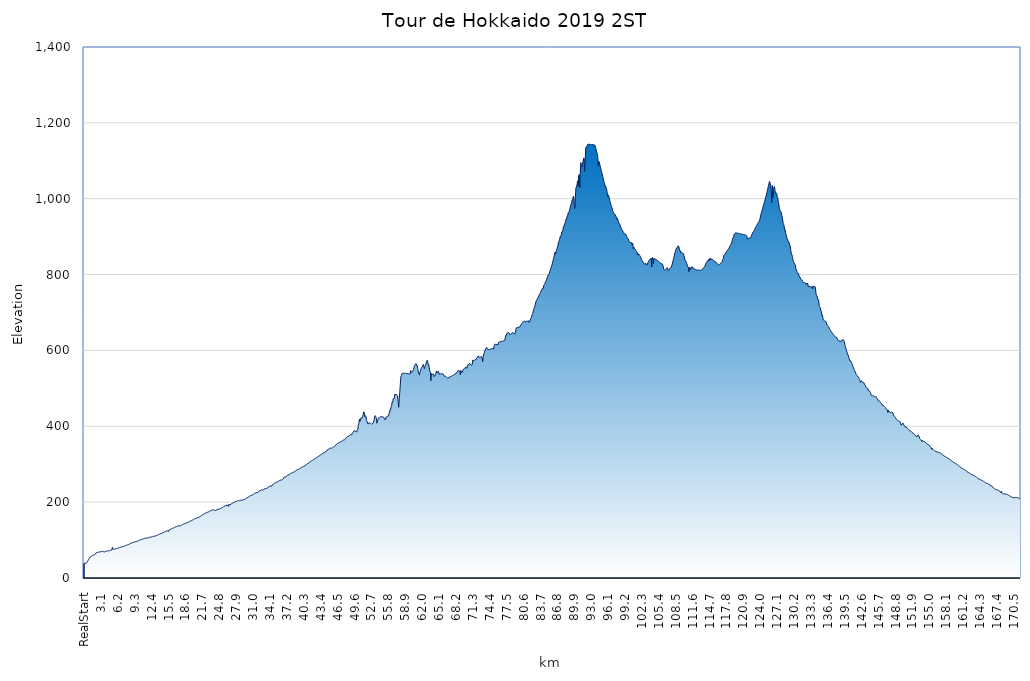
| Category | Ekevation |
|---|---|
| RealStart | 38.4 |
| 0.1  | 39 |
| 0.2  | 38.5 |
| 0.3  | 38.8 |
| 0.4  | 38.6 |
| 0.5  | 40.8 |
| 0.6  | 43 |
| 0.7  | 45.2 |
| 0.8  | 47.4 |
| 0.9  | 49.6 |
| 1.0  | 51.8 |
| 1.1  | 54 |
| 1.2  | 56.2 |
| 1.3  | 57.8 |
| 1.4  | 58 |
| 1.5  | 58.3 |
| 1.6  | 59.6 |
| 1.7  | 60.6 |
| 1.8  | 61 |
| 1.9  | 61.3 |
| 2.0  | 61.7 |
| 2.1  | 62.9 |
| 2.2  | 65.5 |
| 2.3  | 66.8 |
| 2.4  | 67.3 |
| 2.5  | 67.5 |
| 2.6  | 67.9 |
| 2.7  | 68.3 |
| 2.8  | 68.6 |
| 2.9  | 68.9 |
| 3.0  | 69.2 |
| 3.1  | 69.4 |
| 3.2  | 69.5 |
| 3.3  | 70.1 |
| 3.4  | 70.4 |
| 3.5  | 70 |
| 3.6  | 69.1 |
| 3.7  | 69 |
| 3.8  | 68.6 |
| 3.9  | 69.6 |
| 4.0  | 70.1 |
| 4.1  | 70.5 |
| 4.2  | 70.9 |
| 4.3  | 71.6 |
| 4.4  | 71.6 |
| 4.5  | 71.5 |
| 4.6  | 71.9 |
| 4.7  | 72.4 |
| 4.8  | 73 |
| 4.9  | 73.1 |
| 5.0  | 73.5 |
| 5.1  | 73.9 |
| 5.2  | 80.9 |
| 5.3  | 75.3 |
| 5.4  | 75.6 |
| 5.5  | 75.9 |
| 5.6  | 76.2 |
| 5.7  | 76.6 |
| 5.8  | 77.2 |
| 5.9  | 77.5 |
| 6.0  | 77.7 |
| 6.1  | 78 |
| 6.2  | 78.4 |
| 6.3  | 78.9 |
| 6.4  | 79.5 |
| 6.5  | 80 |
| 6.6  | 80.6 |
| 6.7  | 81.2 |
| 6.8  | 81.7 |
| 6.9  | 82.2 |
| 7.0  | 82.5 |
| 7.1  | 82.7 |
| 7.2  | 83 |
| 7.3  | 83.5 |
| 7.4  | 84 |
| 7.5  | 85 |
| 7.6  | 85.2 |
| 7.7  | 85.7 |
| 7.8  | 86.6 |
| 7.9  | 86.6 |
| 8.0  | 87.3 |
| 8.1  | 87.9 |
| 8.2  | 88.4 |
| 8.3  | 89.2 |
| 8.4  | 90.1 |
| 8.5  | 91.1 |
| 8.6  | 91.5 |
| 8.7  | 92 |
| 8.8  | 92.5 |
| 8.9  | 93.1 |
| 9.0  | 93.6 |
| 9.1  | 93.9 |
| 9.2  | 94.5 |
| 9.3  | 95.2 |
| 9.4  | 95.5 |
| 9.5  | 96 |
| 9.6  | 96.2 |
| 9.7  | 97 |
| 9.8  | 97.3 |
| 9.9  | 97.9 |
| 10.0  | 98.6 |
| 10.1  | 99.2 |
| 10.2  | 99.8 |
| 10.3  | 100.6 |
| 10.4  | 101 |
| 10.5  | 101.4 |
| 10.6  | 101.8 |
| 10.7  | 102.1 |
| 10.8  | 102.6 |
| 10.9  | 103.3 |
| 11.0  | 104.1 |
| 11.1  | 104.4 |
| 11.2  | 104.7 |
| 11.3  | 105.3 |
| 11.4  | 105.2 |
| 11.5  | 105.3 |
| 11.6  | 105.3 |
| 11.7  | 105.6 |
| 11.8  | 105.9 |
| 11.9  | 106.4 |
| 12.0  | 107.3 |
| 12.1  | 107 |
| 12.2  | 108 |
| 12.3  | 108 |
| 12.4  | 108 |
| 12.5  | 109 |
| 12.6  | 109 |
| 12.7  | 110 |
| 12.8  | 110 |
| 12.9  | 110 |
| 13.0  | 110 |
| 13.1  | 111 |
| 13.2  | 112 |
| 13.3  | 112 |
| 13.4  | 113 |
| 13.5  | 113 |
| 13.6  | 114 |
| 13.7  | 115 |
| 13.8  | 115 |
| 13.9  | 116 |
| 14.0  | 117 |
| 14.1  | 117 |
| 14.2  | 117 |
| 14.3  | 118 |
| 14.4  | 119 |
| 14.5  | 120 |
| 14.6  | 120 |
| 14.7  | 121 |
| 14.8  | 122 |
| 14.9  | 123 |
| 15.0  | 123 |
| 15.1  | 124 |
| 15.2  | 124 |
| 15.3  | 124 |
| 15.4  | 123 |
| 15.5  | 123 |
| 15.6  | 127 |
| 15.7  | 127.7 |
| 15.8  | 128.2 |
| 15.9  | 128.9 |
| 16.0  | 129.2 |
| 16.1  | 129.8 |
| 16.2  | 130.8 |
| 16.3  | 131.3 |
| 16.4  | 131.8 |
| 16.5  | 132.5 |
| 16.6  | 133.3 |
| 16.7  | 134.1 |
| 16.8  | 134.9 |
| 16.9  | 135.3 |
| 17.0  | 136 |
| 17.1  | 136.7 |
| 17.2  | 137.1 |
| 17.3  | 137.7 |
| 17.4  | 137.3 |
| 17.5  | 137.5 |
| 17.6  | 137.6 |
| 17.7  | 137.7 |
| 17.8  | 138.5 |
| 17.9  | 139.5 |
| 18.0  | 140.4 |
| 18.1  | 141.1 |
| 18.2  | 141.8 |
| 18.3  | 142.6 |
| 18.4  | 142.7 |
| 18.5  | 143.7 |
| 18.6  | 144.2 |
| 18.7  | 144.7 |
| 18.8  | 145.3 |
| 18.9  | 146 |
| 19.0  | 146.2 |
| 19.1  | 147.2 |
| 19.2  | 147.9 |
| 19.3  | 148.4 |
| 19.4  | 149.1 |
| 19.5  | 149.9 |
| 19.6  | 150.7 |
| 19.7  | 151.3 |
| 19.8  | 152.2 |
| 19.9  | 152.8 |
| 20.0  | 153.3 |
| 20.1  | 154.1 |
| 20.2  | 154.9 |
| 20.3  | 156.5 |
| 20.4  | 156.7 |
| 20.5  | 156.8 |
| 20.6  | 157.3 |
| 20.7  | 158.3 |
| 20.8  | 158.6 |
| 20.9  | 159.2 |
| 21.0  | 159.8 |
| 21.1  | 161 |
| 21.2  | 161.1 |
| 21.3  | 161.7 |
| 21.4  | 162.6 |
| 21.5  | 164.6 |
| 21.6  | 165.9 |
| 21.7  | 166.1 |
| 21.8  | 167.1 |
| 21.9  | 168 |
| 22.0  | 168.7 |
| 22.1  | 169.7 |
| 22.2  | 170.6 |
| 22.3  | 171.1 |
| 22.4  | 171.7 |
| 22.5  | 172.7 |
| 22.6  | 173.1 |
| 22.7  | 173.7 |
| 22.8  | 174.3 |
| 22.9  | 174.4 |
| 23.0  | 175.7 |
| 23.1  | 176.5 |
| 23.2  | 177.4 |
| 23.3  | 178.3 |
| 23.4  | 178.8 |
| 23.5  | 179.3 |
| 23.6  | 179.3 |
| 23.7  | 180.3 |
| 23.8  | 180 |
| 23.9  | 178.3 |
| 24.0  | 177.9 |
| 24.1  | 177.9 |
| 24.2  | 178.3 |
| 24.3  | 179.3 |
| 24.4  | 179.6 |
| 24.5  | 179.9 |
| 24.6  | 182.5 |
| 24.7  | 180.9 |
| 24.8  | 181.4 |
| 24.9  | 182.3 |
| 25.0  | 183.1 |
| 25.1  | 184.2 |
| 25.2  | 184.6 |
| 25.3  | 185.2 |
| 25.4  | 186.2 |
| 25.5  | 186.6 |
| 25.6  | 188.1 |
| 25.7  | 189.3 |
| 25.8  | 189.6 |
| 25.9  | 190 |
| 26.0  | 190 |
| 26.1  | 191.9 |
| 26.2  | 193.1 |
| 26.3  | 190.1 |
| 26.4  | 190.3 |
| 26.5  | 188.8 |
| 26.6  | 195.1 |
| 26.7  | 192.8 |
| 26.8  | 192.5 |
| 26.9  | 194.3 |
| 27.0  | 195.5 |
| 27.1  | 195.8 |
| 27.2  | 197.3 |
| 27.3  | 198.2 |
| 27.4  | 198.9 |
| 27.5  | 199.7 |
| 27.6  | 199.8 |
| 27.7  | 200.8 |
| 27.8  | 201.4 |
| 27.9  | 201 |
| 28.0  | 202 |
| 28.1  | 203 |
| 28.2  | 204 |
| 28.3  | 204 |
| 28.4  | 204 |
| 28.5  | 204 |
| 28.6  | 205 |
| 28.7  | 205 |
| 28.8  | 205 |
| 28.9  | 205 |
| 29.0  | 205 |
| 29.1  | 206 |
| 29.2  | 206 |
| 29.3  | 207 |
| 29.4  | 207 |
| 29.5  | 207 |
| 29.6  | 208 |
| 29.7  | 210 |
| 29.8  | 211 |
| 29.9  | 212 |
| 30.0  | 212 |
| 30.1  | 213 |
| 30.2  | 214 |
| 30.3  | 215 |
| 30.4  | 216 |
| 30.5  | 217 |
| 30.6  | 218 |
| 30.7  | 218 |
| 30.8  | 219 |
| 30.9  | 219 |
| 31.0  | 220 |
| 31.1  | 221 |
| 31.2  | 222 |
| 31.3  | 223 |
| 31.4  | 224 |
| 31.5  | 224 |
| 31.6  | 226 |
| 31.7  | 225 |
| 31.8  | 225 |
| 31.9  | 226 |
| 32.0  | 227 |
| 32.1  | 229 |
| 32.2  | 230 |
| 32.3  | 230 |
| 32.4  | 231 |
| 32.5  | 232 |
| 32.6  | 233 |
| 32.7  | 232 |
| 32.8  | 232 |
| 32.9  | 232 |
| 33.0  | 234 |
| 33.1  | 235 |
| 33.2  | 236 |
| 33.3  | 236 |
| 33.4  | 236 |
| 33.5  | 236 |
| 33.6  | 237 |
| 33.7  | 238 |
| 33.8  | 240 |
| 33.9  | 240 |
| 34.0  | 242 |
| 34.1  | 242 |
| 34.2  | 242 |
| 34.3  | 241 |
| 34.4  | 242 |
| 34.5  | 245.8 |
| 34.6  | 246 |
| 34.7  | 246.8 |
| 34.8  | 248.1 |
| 34.9  | 249.4 |
| 35.0  | 250.2 |
| 35.1  | 251.2 |
| 35.2  | 251.9 |
| 35.3  | 252.7 |
| 35.4  | 253.1 |
| 35.5  | 253.6 |
| 35.6  | 254.6 |
| 35.7  | 255.7 |
| 35.8  | 256.6 |
| 35.9  | 257.6 |
| 36.0  | 258.2 |
| 36.1  | 258.4 |
| 36.2  | 258 |
| 36.3  | 259 |
| 36.4  | 260 |
| 36.5  | 261 |
| 36.6  | 263 |
| 36.7  | 266 |
| 36.8  | 266 |
| 36.9  | 266 |
| 37.0  | 267 |
| 37.1  | 268 |
| 37.2  | 269 |
| 37.3  | 270 |
| 37.4  | 272 |
| 37.5  | 272 |
| 37.6  | 272 |
| 37.7  | 274 |
| 37.8  | 275 |
| 37.9  | 276 |
| 38.0  | 276 |
| 38.1  | 277 |
| 38.2  | 277.9 |
| 38.3  | 278.6 |
| 38.4  | 279.1 |
| 38.5  | 279.3 |
| 38.6  | 280.2 |
| 38.7  | 281.3 |
| 38.8  | 282.5 |
| 38.9  | 283.6 |
| 39.0  | 284.7 |
| 39.1  | 285.7 |
| 39.2  | 286.3 |
| 39.3  | 286 |
| 39.4  | 287 |
| 39.5  | 288 |
| 39.6  | 289 |
| 39.7  | 290 |
| 39.8  | 291 |
| 39.9  | 292 |
| 40.0  | 292 |
| 40.1  | 293 |
| 40.2  | 294 |
| 40.3  | 295 |
| 40.4  | 295 |
| 40.5  | 296 |
| 40.6  | 298 |
| 40.7  | 298 |
| 40.8  | 299 |
| 40.9  | 300 |
| 41.0  | 302 |
| 41.1  | 302 |
| 41.2  | 303 |
| 41.3  | 305 |
| 41.4  | 306 |
| 41.5  | 307 |
| 41.6  | 308 |
| 41.7  | 309 |
| 41.8  | 310 |
| 41.9  | 310 |
| 42.0  | 312 |
| 42.1  | 313 |
| 42.2  | 313 |
| 42.3  | 314 |
| 42.4  | 315 |
| 42.5  | 316 |
| 42.6  | 317 |
| 42.7  | 318 |
| 42.8  | 319 |
| 42.9  | 320 |
| 43.0  | 321 |
| 43.1  | 321 |
| 43.2  | 323 |
| 43.3  | 324 |
| 43.4  | 325 |
| 43.5  | 326 |
| 43.6  | 326 |
| 43.7  | 327 |
| 43.8  | 329 |
| 43.9  | 330 |
| 44.0  | 330 |
| 44.1  | 331 |
| 44.2  | 332 |
| 44.3  | 333 |
| 44.4  | 335 |
| 44.5  | 335 |
| 44.6  | 337 |
| 44.7  | 338 |
| 44.8  | 340 |
| 44.9  | 340 |
| 45.0  | 341 |
| 45.1  | 342 |
| 45.2  | 343 |
| 45.3  | 342 |
| 45.4  | 342 |
| 45.5  | 343 |
| 45.6  | 344 |
| 45.7  | 345 |
| 45.8  | 346 |
| 45.9  | 347 |
| 46.0  | 348 |
| 46.1  | 349 |
| 46.2  | 351 |
| 46.3  | 353 |
| 46.4  | 354 |
| 46.5  | 355 |
| 46.6  | 356 |
| 46.7  | 356 |
| 46.8  | 357 |
| 46.9  | 358 |
| 47.0  | 359 |
| 47.1  | 360 |
| 47.2  | 360 |
| 47.3  | 361 |
| 47.4  | 362 |
| 47.5  | 363 |
| 47.6  | 364 |
| 47.7  | 364 |
| 47.8  | 365 |
| 47.9  | 366 |
| 48.0  | 369 |
| 48.1  | 370 |
| 48.2  | 372 |
| 48.3  | 373 |
| 48.4  | 374 |
| 48.5  | 374 |
| 48.6  | 375 |
| 48.7  | 376 |
| 48.8  | 377 |
| 48.9  | 377 |
| 49.0  | 379 |
| 49.1  | 378 |
| 49.2  | 382 |
| 49.3  | 383 |
| 49.4  | 385 |
| 49.5  | 388 |
| 49.6  | 389 |
| 49.7  | 387 |
| 49.8  | 387 |
| 49.9  | 385 |
| 50.0  | 385 |
| 50.1  | 390 |
| 50.2  | 392 |
| 50.3  | 402 |
| 50.4  | 408 |
| 50.5  | 419 |
| 50.6  | 413 |
| 50.7  | 416 |
| 50.8  | 423 |
| 50.9  | 422 |
| 51.0  | 422 |
| 51.1  | 426 |
| 51.2  | 432 |
| 51.3  | 438 |
| 51.4  | 436 |
| 51.5  | 425 |
| 51.6  | 428 |
| 51.7  | 425 |
| 51.8  | 415 |
| 51.9  | 413 |
| 52.0  | 407 |
| 52.1  | 406 |
| 52.2  | 409 |
| 52.3  | 409 |
| 52.4  | 409 |
| 52.5  | 408 |
| 52.6  | 407 |
| 52.7  | 406 |
| 52.8  | 406 |
| 52.9  | 407 |
| 53.0  | 408 |
| 53.1  | 412 |
| 53.2  | 417 |
| 53.3  | 426 |
| 53.4  | 428 |
| 53.5  | 425 |
| 53.6  | 421 |
| 53.7  | 408 |
| 53.8  | 412 |
| 53.9  | 418 |
| 54.0  | 422 |
| 54.1  | 421 |
| 54.2  | 423 |
| 54.3  | 424 |
| 54.4  | 426 |
| 54.5  | 424 |
| 54.6  | 426 |
| 54.7  | 425 |
| 54.8  | 424 |
| 54.9  | 424 |
| 55.0  | 423 |
| 55.1  | 418 |
| 55.2  | 418 |
| 55.3  | 418 |
| 55.4  | 425 |
| 55.5  | 424 |
| 55.6  | 426 |
| 55.7  | 427 |
| 55.8  | 427 |
| 55.9  | 431 |
| 56.0  | 437 |
| 56.1  | 443 |
| 56.2  | 443 |
| 56.3  | 452 |
| 56.4  | 453 |
| 56.5  | 464 |
| 56.6  | 463 |
| 56.7  | 473 |
| 56.8  | 472 |
| 56.9  | 475 |
| 57.0  | 485 |
| 57.1  | 483 |
| 57.2  | 485 |
| 57.3  | 483.333 |
| 57.4  | 481.667 |
| 57.5  | 480 |
| 57.6  | 466 |
| 57.7  | 450 |
| 57.8  | 470.25 |
| 57.9  | 490.5 |
| 58.0  | 510.75 |
| 58.1  | 531 |
| 58.2  | 534 |
| 58.3  | 539 |
| 58.4  | 539.333 |
| 58.5  | 539.667 |
| 58.6  | 540 |
| 58.7  | 539.833 |
| 58.8  | 539.667 |
| 58.9  | 539.5 |
| 59.0  | 539.333 |
| 59.1  | 539.167 |
| 59.2  | 539 |
| 59.3  | 538.833 |
| 59.4  | 538.667 |
| 59.5  | 538.5 |
| 59.6  | 538.333 |
| 59.7  | 538.167 |
| 59.8  | 538 |
| 59.9  | 547 |
| 60.0  | 544 |
| 60.1  | 542 |
| 60.2  | 545 |
| 60.3  | 546 |
| 60.4  | 549 |
| 60.5  | 554 |
| 60.6  | 560 |
| 60.7  | 563 |
| 60.8  | 564 |
| 60.9  | 565 |
| 61.0  | 560 |
| 61.1  | 560 |
| 61.2  | 552 |
| 61.3  | 543 |
| 61.4  | 540 |
| 61.5  | 535 |
| 61.6  | 543 |
| 61.7  | 546 |
| 61.8  | 552 |
| 61.9  | 555 |
| 62.0  | 556 |
| 62.1  | 560 |
| 62.2  | 563 |
| 62.3  | 559 |
| 62.4  | 552 |
| 62.5  | 556 |
| 62.6  | 560.5 |
| 62.7  | 565 |
| 62.8  | 569.5 |
| 62.9  | 574 |
| 63.0  | 572 |
| 63.1  | 563 |
| 63.2  | 564 |
| 63.3  | 554 |
| 63.4  | 545 |
| 63.5  | 543 |
| 63.6  | 520 |
| 63.7  | 539 |
| 63.8  | 537 |
| 63.9  | 537 |
| 64.0  | 538 |
| 64.1  | 538 |
| 64.2  | 531 |
| 64.3  | 534 |
| 64.4  | 534 |
| 64.5  | 537 |
| 64.6  | 546 |
| 64.7  | 542 |
| 64.8  | 542 |
| 64.9  | 545 |
| 65.0  | 545 |
| 65.1  | 537 |
| 65.2  | 538 |
| 65.3  | 537 |
| 65.4  | 539 |
| 65.5  | 538 |
| 65.6  | 538 |
| 65.7  | 538 |
| 65.8  | 539 |
| 65.9  | 537 |
| 66.0  | 533 |
| 66.1  | 532 |
| 66.2  | 533 |
| 66.3  | 532 |
| 66.4  | 531 |
| 66.5  | 529 |
| 66.6  | 528 |
| 66.7  | 527 |
| 66.8  | 528 |
| 66.9  | 527 |
| 67.0  | 530 |
| 67.1  | 531 |
| 67.2  | 531 |
| 67.3  | 531 |
| 67.4  | 532 |
| 67.5  | 533 |
| 67.6  | 534 |
| 67.7  | 534 |
| 67.8  | 535 |
| 67.9  | 537 |
| 68.0  | 537 |
| 68.1  | 538 |
| 68.2  | 541 |
| 68.3  | 541 |
| 68.4  | 542 |
| 68.5  | 546 |
| 68.6  | 547 |
| 68.7  | 547 |
| 68.8  | 546 |
| 68.9  | 546 |
| 69.0  | 536 |
| 69.1  | 547 |
| 69.2  | 541 |
| 69.3  | 544 |
| 69.4  | 543 |
| 69.5  | 548 |
| 69.6  | 551 |
| 69.7  | 551 |
| 69.8  | 553 |
| 69.9  | 555 |
| 70.0  | 556 |
| 70.1  | 553 |
| 70.2  | 553 |
| 70.3  | 561 |
| 70.4  | 563 |
| 70.5  | 562 |
| 70.6  | 563 |
| 70.7  | 566 |
| 70.8  | 565 |
| 70.9  | 562 |
| 71.0  | 561.5 |
| 71.1  | 561 |
| 71.2  | 564 |
| 71.3  | 575 |
| 71.4  | 572 |
| 71.5  | 573 |
| 71.6  | 575 |
| 71.7  | 576 |
| 71.8  | 575 |
| 71.9  | 577 |
| 72.0  | 580 |
| 72.1  | 581 |
| 72.2  | 584 |
| 72.3  | 585 |
| 72.4  | 582 |
| 72.5  | 582 |
| 72.6  | 583 |
| 72.7  | 582 |
| 72.8  | 584 |
| 72.9  | 584 |
| 73.0  | 580 |
| 73.1  | 570 |
| 73.2  | 583 |
| 73.3  | 591 |
| 73.4  | 594 |
| 73.5  | 599 |
| 73.6  | 604 |
| 73.7  | 605 |
| 73.8  | 608 |
| 73.9  | 606 |
| 74.0  | 603 |
| 74.1  | 603 |
| 74.2  | 601 |
| 74.3  | 602 |
| 74.4  | 602 |
| 74.5  | 604 |
| 74.6  | 605 |
| 74.7  | 604 |
| 74.8  | 605 |
| 74.9  | 605 |
| 75.0  | 606 |
| 75.1  | 603 |
| 75.2  | 613 |
| 75.3  | 616 |
| 75.4  | 616 |
| 75.5  | 616 |
| 75.6  | 615 |
| 75.7  | 617 |
| 75.8  | 615 |
| 75.9  | 614 |
| 76.0  | 621 |
| 76.1  | 621 |
| 76.2  | 622 |
| 76.3  | 624 |
| 76.4  | 623 |
| 76.5  | 624 |
| 76.6  | 624 |
| 76.7  | 624 |
| 76.8  | 625 |
| 76.9  | 625 |
| 77.0  | 625 |
| 77.1  | 626 |
| 77.2  | 630 |
| 77.3  | 639 |
| 77.4  | 639 |
| 77.5  | 645 |
| 77.6  | 645 |
| 77.7  | 646 |
| 77.8  | 647 |
| 77.9  | 647 |
| 78.0  | 644 |
| 78.1  | 641 |
| 78.2  | 642 |
| 78.3  | 644 |
| 78.4  | 645 |
| 78.5  | 647 |
| 78.6  | 647 |
| 78.7  | 645 |
| 78.8  | 646 |
| 78.9  | 645 |
| 79.0  | 643 |
| 79.1  | 648 |
| 79.2  | 656 |
| 79.3  | 660 |
| 79.4  | 660 |
| 79.5  | 660 |
| 79.6  | 662 |
| 79.7  | 662 |
| 79.8  | 661 |
| 79.9  | 661 |
| 80.0  | 665 |
| 80.1  | 666 |
| 80.2  | 670 |
| 80.3  | 671 |
| 80.4  | 674 |
| 80.5  | 675 |
| 80.6  | 675 |
| 80.7  | 677 |
| 80.8  | 678 |
| 80.9  | 676 |
| 81.0  | 675 |
| 81.1  | 677 |
| 81.2  | 677 |
| 81.3  | 677 |
| 81.4  | 678 |
| 81.5  | 678 |
| 81.6  | 674 |
| 81.7  | 677 |
| 81.8  | 677 |
| 81.9  | 684 |
| 82.0  | 686 |
| 82.1  | 691 |
| 82.2  | 695 |
| 82.3  | 698 |
| 82.4  | 706 |
| 82.5  | 711 |
| 82.6  | 713 |
| 82.7  | 719 |
| 82.8  | 725 |
| 82.9  | 730 |
| 83.0  | 732 |
| 83.1  | 736 |
| 83.2  | 738 |
| 83.3  | 741 |
| 83.4  | 744 |
| 83.5  | 748 |
| 83.6  | 750 |
| 83.7  | 753 |
| 83.8  | 756 |
| 83.9  | 759 |
| 84.0  | 763 |
| 84.1  | 762 |
| 84.2  | 764 |
| 84.3  | 772 |
| 84.4  | 774 |
| 84.5  | 775 |
| 84.6  | 781 |
| 84.7  | 782 |
| 84.8  | 786 |
| 84.9  | 791 |
| 85.0  | 794 |
| 85.1  | 800 |
| 85.2  | 801 |
| 85.3  | 802 |
| 85.4  | 808 |
| 85.5  | 812 |
| 85.6  | 816 |
| 85.7  | 822 |
| 85.8  | 825 |
| 85.9  | 831 |
| 86.0  | 837 |
| 86.1  | 843 |
| 86.2  | 848 |
| 86.3  | 857 |
| 86.4  | 859 |
| 86.5  | 855 |
| 86.6  | 863 |
| 86.7  | 867 |
| 86.8  | 873 |
| 86.9  | 877 |
| 87.0  | 886 |
| 87.1  | 887 |
| 87.2  | 893 |
| 87.3  | 899 |
| 87.4  | 902 |
| 87.5  | 904 |
| 87.6  | 912 |
| 87.7  | 912 |
| 87.8  | 917 |
| 87.9  | 926 |
| 88.0  | 926 |
| 88.1  | 934 |
| 88.2  | 935 |
| 88.3  | 941 |
| 88.4  | 947 |
| 88.5  | 947 |
| 88.6  | 955 |
| 88.7  | 957 |
| 88.8  | 964 |
| 88.9  | 965 |
| 89.0  | 967 |
| 89.1  | 975 |
| 89.2  | 978 |
| 89.3  | 986 |
| 89.4  | 988 |
| 89.5  | 997 |
| 89.6  | 997 |
| 89.7  | 1006 |
| 89.8  | 1006 |
| 89.9  | 984 |
| 90.0  | 974 |
| 90.1  | 1003 |
| 90.2  | 1030 |
| 90.3  | 1031 |
| 90.4  | 1037 |
| 90.5  | 1047 |
| 90.6  | 1033 |
| 90.7  | 1061 |
| 90.8  | 1064 |
| 90.9  | 1029 |
| 91.0  | 1073 |
| 91.1  | 1095 |
| 91.2  | 1084 |
| 91.3  | 1086 |
| 91.4  | 1094 |
| 91.5  | 1097 |
| 91.6  | 1107 |
| 91.7  | 1107 |
| 91.8  | 1072 |
| 91.9  | 1103 |
| 92.0  | 1135 |
| 92.1  | 1137 |
| 92.2  | 1138 |
| 92.3  | 1142 |
| 92.4  | 1144 |
| 92.5  | 1143.777 |
| 92.6  | 1143.554 |
| 92.7  | 1143.331 |
| 92.8  | 1143.108 |
| 92.9  | 1142.885 |
| 93.0  | 1142.662 |
| 93.1  | 1142.438 |
| 93.2  | 1142.215 |
| 93.3  | 1143.998 |
| 93.4  | 1141.769 |
| 93.5  | 1141.546 |
| 93.6  | 1141.323 |
| 93.7  | 1141.1 |
| 93.8  | 1134.7 |
| 93.9  | 1129.3 |
| 94.0  | 1124.2 |
| 94.1  | 1118.5 |
| 94.2  | 1110.5 |
| 94.3  | 1086 |
| 94.4  | 1098.7 |
| 94.5  | 1094.5 |
| 94.6  | 1089 |
| 94.7  | 1082.7 |
| 94.8  | 1077 |
| 94.9  | 1071.1 |
| 95.0  | 1065.6 |
| 95.1  | 1059.4 |
| 95.2  | 1053.6 |
| 95.3  | 1047.6 |
| 95.4  | 1040.7 |
| 95.5  | 1034.2 |
| 95.6  | 1035.1 |
| 95.7  | 1030.9 |
| 95.8  | 1026 |
| 95.9  | 1019.4 |
| 96.0  | 1005.2 |
| 96.1  | 1010.3 |
| 96.2  | 1007.9 |
| 96.3  | 1002 |
| 96.4  | 995.7 |
| 96.5  | 990.3 |
| 96.6  | 984.2 |
| 96.7  | 980.2 |
| 96.8  | 976.6 |
| 96.9  | 968.8 |
| 97.0  | 965.8 |
| 97.1  | 963.1 |
| 97.2  | 960.6 |
| 97.3  | 957.9 |
| 97.4  | 957.8 |
| 97.5  | 954 |
| 97.6  | 951.4 |
| 97.7  | 945.5 |
| 97.8  | 948.1 |
| 97.9  | 943.5 |
| 98.0  | 939.4 |
| 98.1  | 933.5 |
| 98.2  | 933.7 |
| 98.3  | 930.3 |
| 98.4  | 925.4 |
| 98.5  | 922.5 |
| 98.6  | 918.7 |
| 98.7  | 917.2 |
| 98.8  | 914.3 |
| 98.9  | 911.8 |
| 99.0  | 910.6 |
| 99.1  | 907.6 |
| 99.2  | 905.8 |
| 99.3  | 906.8 |
| 99.4  | 903.8 |
| 99.5  | 900 |
| 99.6  | 897.5 |
| 99.7  | 894.4 |
| 99.8  | 894.3 |
| 99.9  | 888.7 |
| 100.0  | 885.6 |
| 100.1  | 885.8 |
| 100.2  | 884.3 |
| 100.3  | 885.1 |
| 100.4  | 884.3 |
| 100.5  | 877.9 |
| 100.6  | 883 |
| 100.7  | 868.4 |
| 100.8  | 873 |
| 100.9  | 868.3 |
| 101.0  | 868.2 |
| 101.1  | 865.9 |
| 101.2  | 862.6 |
| 101.3  | 860.9 |
| 101.4  | 859.8 |
| 101.5  | 851.7 |
| 101.6  | 851.5 |
| 101.7  | 854.7 |
| 101.8  | 852.2 |
| 101.9  | 850.3 |
| 102.0  | 847.3 |
| 102.1  | 843.8 |
| 102.2  | 840.5 |
| 102.3  | 837.8 |
| 102.4  | 835.5 |
| 102.5  | 832.5 |
| 102.6  | 830 |
| 102.7  | 827.1 |
| 102.8  | 827.7 |
| 102.9  | 829.5 |
| 103.0  | 829.8 |
| 103.1  | 827.9 |
| 103.2  | 824.7 |
| 103.3  | 827.6 |
| 103.4  | 831.6 |
| 103.5  | 834 |
| 103.6  | 837.3 |
| 103.7  | 839.4 |
| 103.8  | 841 |
| 103.9  | 841.1 |
| 104.0  | 843.4 |
| 104.1  | 819.7 |
| 104.2  | 844.8 |
| 104.3  | 844 |
| 104.4  | 827.9 |
| 104.5  | 842.8 |
| 104.6  | 840.7 |
| 104.7  | 841.8 |
| 104.8  | 840.9 |
| 104.9  | 839.1 |
| 105.0  | 838.3 |
| 105.1  | 837.5 |
| 105.2  | 836.7 |
| 105.3  | 835.5 |
| 105.4  | 834.6 |
| 105.5  | 833.3 |
| 105.6  | 831.7 |
| 105.7  | 830.8 |
| 105.8  | 829.3 |
| 105.9  | 829.4 |
| 106.0  | 826.5 |
| 106.1  | 826.7 |
| 106.2  | 821.8 |
| 106.3  | 814.2 |
| 106.4  | 812.9 |
| 106.5  | 812 |
| 106.6  | 813.1 |
| 106.7  | 813.5 |
| 106.8  | 815.5 |
| 106.9  | 818.1 |
| 107.0  | 814.5 |
| 107.1  | 811.5 |
| 107.2  | 810.3 |
| 107.3  | 815.3 |
| 107.4  | 815.3 |
| 107.5  | 816.3 |
| 107.6  | 817.4 |
| 107.7  | 819.9 |
| 107.8  | 824.9 |
| 107.9  | 830.5 |
| 108.0  | 836.1 |
| 108.1  | 842.2 |
| 108.2  | 848 |
| 108.3  | 854.4 |
| 108.4  | 859.1 |
| 108.5  | 864.7 |
| 108.6  | 867.3 |
| 108.7  | 870.1 |
| 108.8  | 873.1 |
| 108.9  | 875.6 |
| 109.0  | 875 |
| 109.1  | 872.4 |
| 109.2  | 863.5 |
| 109.3  | 863.6 |
| 109.4  | 858.1 |
| 109.5  | 859.6 |
| 109.6  | 858.9 |
| 109.7  | 855.9 |
| 109.8  | 855.8 |
| 109.9  | 855.3 |
| 110.0  | 849.5 |
| 110.1  | 846.1 |
| 110.2  | 836.3 |
| 110.3  | 836.5 |
| 110.4  | 834.5 |
| 110.5  | 829.6 |
| 110.6  | 825.2 |
| 110.7  | 820.8 |
| 110.8  | 819.2 |
| 110.9  | 807.3 |
| 111.0  | 819.7 |
| 111.1  | 818.8 |
| 111.2  | 812.3 |
| 111.3  | 815.6 |
| 111.4  | 820.2 |
| 111.5  | 820.5 |
| 111.6  | 819.9 |
| 111.7  | 815.9 |
| 111.8  | 815.362 |
| 111.9  | 814.825 |
| 112.0  | 814.288 |
| 112.1  | 813.75 |
| 112.2  | 813.212 |
| 112.3  | 812.675 |
| 112.4  | 812.138 |
| 112.5  | 811.6 |
| 112.6  | 812 |
| 112.7  | 812 |
| 112.8  | 811.8 |
| 112.9  | 811.9 |
| 113.0  | 810.1 |
| 113.1  | 811.314 |
| 113.2  | 812.529 |
| 113.3  | 813.743 |
| 113.4  | 814.957 |
| 113.5  | 816.171 |
| 113.6  | 817.386 |
| 113.7  | 818.6 |
| 113.8  | 821.8 |
| 113.9  | 824.7 |
| 114.0  | 828.3 |
| 114.1  | 831.3 |
| 114.2  | 833.6 |
| 114.3  | 835.9 |
| 114.4  | 836 |
| 114.5  | 839.9 |
| 114.6  | 836 |
| 114.7  | 842.3 |
| 114.8  | 839.1 |
| 114.9  | 842.6 |
| 115.0  | 840.4 |
| 115.1  | 840.7 |
| 115.2  | 839.9 |
| 115.3  | 839.5 |
| 115.4  | 838.3 |
| 115.5  | 836.1 |
| 115.6  | 835.1 |
| 115.7  | 835.2 |
| 115.8  | 833.2 |
| 115.9  | 832.5 |
| 116.0  | 831 |
| 116.1  | 829.5 |
| 116.2  | 827.1 |
| 116.3  | 825.9 |
| 116.4  | 825.8 |
| 116.5  | 826.8 |
| 116.6  | 826.9 |
| 116.7  | 829.3 |
| 116.8  | 829.6 |
| 116.9  | 831 |
| 117.0  | 833.9 |
| 117.1  | 840 |
| 117.2  | 841.5 |
| 117.3  | 850.5 |
| 117.4  | 851.3 |
| 117.5  | 852.9 |
| 117.6  | 856.3 |
| 117.7  | 858.1 |
| 117.8  | 860.2 |
| 117.9  | 862.6 |
| 118.0  | 864.6 |
| 118.1  | 865.9 |
| 118.2  | 868.7 |
| 118.3  | 871 |
| 118.4  | 874.7 |
| 118.5  | 877 |
| 118.6  | 879.5 |
| 118.7  | 882.6 |
| 118.8  | 886 |
| 118.9  | 893.2 |
| 119.0  | 897.4 |
| 119.1  | 898.9 |
| 119.2  | 905.9 |
| 119.3  | 908.2 |
| 119.4  | 909.1 |
| 119.5  | 910.2 |
| 119.6  | 909.883 |
| 119.7  | 909.567 |
| 119.8  | 909.25 |
| 119.9  | 908.933 |
| 120.0  | 908.775 |
| 120.1  | 908.617 |
| 120.2  | 907.983 |
| 120.3  | 907.667 |
| 120.4  | 907.35 |
| 120.5  | 907.033 |
| 120.6  | 906.717 |
| 120.7  | 906.4 |
| 120.8  | 906.083 |
| 120.9  | 905.767 |
| 121.0  | 905.45 |
| 121.1  | 905.133 |
| 121.2  | 904.817 |
| 121.3  | 904.5 |
| 121.4  | 902.8 |
| 121.5  | 901.8 |
| 121.6  | 896.8 |
| 121.7  | 893.2 |
| 121.8  | 895 |
| 121.9  | 896.7 |
| 122.0  | 896.8 |
| 122.1  | 895.8 |
| 122.2  | 897.7 |
| 122.3  | 899.9 |
| 122.4  | 904.3 |
| 122.5  | 906.4 |
| 122.6  | 910.2 |
| 122.7  | 912.9 |
| 122.8  | 914.1 |
| 122.9  | 916.8 |
| 123.0  | 919.7 |
| 123.1  | 923.4 |
| 123.2  | 925.6 |
| 123.3  | 928.9 |
| 123.4  | 931.4 |
| 123.5  | 934.2 |
| 123.6  | 936.3 |
| 123.7  | 938.4 |
| 123.8  | 940.7 |
| 123.9  | 943.6 |
| 124.0  | 951.2 |
| 124.1  | 957.1 |
| 124.2  | 962.9 |
| 124.3  | 967.9 |
| 124.4  | 973.4 |
| 124.5  | 978.4 |
| 124.6  | 983.5 |
| 124.7  | 988.1 |
| 124.8  | 993.2 |
| 124.9  | 999.3 |
| 125.0  | 1004.2 |
| 125.1  | 1009.7 |
| 125.2  | 1016.3 |
| 125.3  | 1021.5 |
| 125.4  | 1028.1 |
| 125.5  | 1034.6 |
| 125.6  | 1041 |
| 125.7  | 1045.6 |
| 125.8  | 1041 |
| 125.9  | 1035 |
| 126.0  | 1024 |
| 126.1  | 989.9 |
| 126.2  | 1035 |
| 126.3  | 1003 |
| 126.4  | 1008 |
| 126.5  | 1031 |
| 126.6  | 1032 |
| 126.7  | 1021 |
| 126.8  | 1015 |
| 126.9  | 1016 |
| 127.0  | 1014 |
| 127.1  | 1004 |
| 127.2  | 1003 |
| 127.3  | 992 |
| 127.4  | 986 |
| 127.5  | 973 |
| 127.6  | 970 |
| 127.7  | 966 |
| 127.8  | 966 |
| 127.9  | 957 |
| 128.0  | 954 |
| 128.1  | 944 |
| 128.2  | 935 |
| 128.3  | 932 |
| 128.4  | 925 |
| 128.5  | 915 |
| 128.6  | 916 |
| 128.7  | 905 |
| 128.8  | 904 |
| 128.9  | 893 |
| 129.0  | 893 |
| 129.1  | 887 |
| 129.2  | 887 |
| 129.3  | 883 |
| 129.4  | 878 |
| 129.5  | 875 |
| 129.6  | 863 |
| 129.7  | 854 |
| 129.8  | 853 |
| 129.9  | 845 |
| 130.0  | 837 |
| 130.1  | 834 |
| 130.2  | 831 |
| 130.3  | 827 |
| 130.4  | 826 |
| 130.5  | 817 |
| 130.6  | 812 |
| 130.7  | 809 |
| 130.8  | 805 |
| 130.9  | 802 |
| 131.0  | 803 |
| 131.1  | 797 |
| 131.2  | 793 |
| 131.3  | 793 |
| 131.4  | 789 |
| 131.5  | 787 |
| 131.6  | 785 |
| 131.7  | 785 |
| 131.8  | 781 |
| 131.9  | 779 |
| 132.0  | 779 |
| 132.1  | 779 |
| 132.2  | 778 |
| 132.3  | 777 |
| 132.4  | 774 |
| 132.5  | 777 |
| 132.6  | 775 |
| 132.7  | 777 |
| 132.8  | 768 |
| 132.9  | 768 |
| 133.0  | 769 |
| 133.1  | 767 |
| 133.2  | 768 |
| 133.3  | 767 |
| 133.4  | 768 |
| 133.5  | 769 |
| 133.6  | 762 |
| 133.7  | 768 |
| 133.8  | 770 |
| 133.9  | 769 |
| 134.0  | 767 |
| 134.1  | 767 |
| 134.2  | 751 |
| 134.3  | 745 |
| 134.4  | 744 |
| 134.5  | 735 |
| 134.6  | 733 |
| 134.7  | 734 |
| 134.8  | 718 |
| 134.9  | 715 |
| 135.0  | 713 |
| 135.1  | 704 |
| 135.2  | 703 |
| 135.3  | 692 |
| 135.4  | 693 |
| 135.5  | 682 |
| 135.6  | 682 |
| 135.7  | 679 |
| 135.8  | 677 |
| 135.9  | 677 |
| 136.0  | 677 |
| 136.1  | 674 |
| 136.2  | 667 |
| 136.3  | 666.7 |
| 136.4  | 664.9 |
| 136.5  | 663.2 |
| 136.6  | 660.3 |
| 136.7  | 656.2 |
| 136.8  | 654.4 |
| 136.9  | 652.1 |
| 137.0  | 650.1 |
| 137.1  | 647.9 |
| 137.2  | 646 |
| 137.3  | 644 |
| 137.4  | 641.9 |
| 137.5  | 640 |
| 137.6  | 638.8 |
| 137.7  | 637.5 |
| 137.8  | 635.9 |
| 137.9  | 634.1 |
| 138.0  | 634.9 |
| 138.1  | 631.7 |
| 138.2  | 627.5 |
| 138.3  | 626.3 |
| 138.4  | 625.6 |
| 138.5  | 624.9 |
| 138.6  | 626 |
| 138.7  | 623 |
| 138.8  | 624 |
| 138.9  | 624.9 |
| 139.0  | 627.2 |
| 139.1  | 628.7 |
| 139.2  | 628.9 |
| 139.3  | 626.7 |
| 139.4  | 622.6 |
| 139.5  | 615.6 |
| 139.6  | 609.9 |
| 139.7  | 605.2 |
| 139.8  | 599.6 |
| 139.9  | 595.2 |
| 140.0  | 590.6 |
| 140.1  | 588 |
| 140.2  | 582 |
| 140.3  | 578 |
| 140.4  | 573 |
| 140.5  | 573 |
| 140.6  | 572 |
| 140.7  | 567 |
| 140.8  | 565.7 |
| 140.9  | 561.4 |
| 141.0  | 557.5 |
| 141.1  | 554 |
| 141.2  | 550.1 |
| 141.3  | 546.8 |
| 141.4  | 543.4 |
| 141.5  | 540.2 |
| 141.6  | 536.5 |
| 141.7  | 534.4 |
| 141.8  | 533 |
| 141.9  | 531.1 |
| 142.0  | 529 |
| 142.1  | 526.2 |
| 142.2  | 522.9 |
| 142.3  | 519.9 |
| 142.4  | 515.8 |
| 142.5  | 519.4 |
| 142.6  | 519.3 |
| 142.7  | 517.9 |
| 142.8  | 516 |
| 142.9  | 514.1 |
| 143.0  | 515 |
| 143.1  | 511 |
| 143.2  | 509 |
| 143.3  | 505 |
| 143.4  | 503 |
| 143.5  | 501 |
| 143.6  | 500 |
| 143.7  | 500 |
| 143.8  | 494 |
| 143.9  | 494.8 |
| 144.0  | 493.8 |
| 144.1  | 491.3 |
| 144.2  | 489 |
| 144.3  | 483.6 |
| 144.4  | 480.9 |
| 144.5  | 482 |
| 144.6  | 480.5 |
| 144.7  | 480.3 |
| 144.8  | 479.5 |
| 144.9  | 479 |
| 145.0  | 477.8 |
| 145.1  | 477 |
| 145.2  | 478.5 |
| 145.3  | 475.8 |
| 145.4  | 474.2 |
| 145.5  | 471.8 |
| 145.6  | 469.1 |
| 145.7  | 466.8 |
| 145.8  | 466.8 |
| 145.9  | 466 |
| 146.0  | 463.9 |
| 146.1  | 462.1 |
| 146.2  | 460.2 |
| 146.3  | 458.3 |
| 146.4  | 455 |
| 146.5  | 455.8 |
| 146.6  | 454.5 |
| 146.7  | 453 |
| 146.8  | 451.5 |
| 146.9  | 449.9 |
| 147.0  | 448.5 |
| 147.1  | 445.6 |
| 147.2  | 443.8 |
| 147.3  | 443.1 |
| 147.4  | 436 |
| 147.5  | 442.1 |
| 147.6  | 440.4 |
| 147.7  | 438.1 |
| 147.8  | 437.3 |
| 147.9  | 436.2 |
| 148.0  | 437 |
| 148.1  | 437 |
| 148.2  | 437 |
| 148.3  | 435 |
| 148.4  | 430 |
| 148.5  | 429 |
| 148.6  | 426.5 |
| 148.7  | 424.1 |
| 148.8  | 422 |
| 148.9  | 419.8 |
| 149.0  | 418 |
| 149.1  | 416.7 |
| 149.2  | 415.5 |
| 149.3  | 414.2 |
| 149.4  | 413.1 |
| 149.5  | 412 |
| 149.6  | 413 |
| 149.7  | 410 |
| 149.8  | 403 |
| 149.9  | 403 |
| 150.0  | 406 |
| 150.1  | 408 |
| 150.2  | 408 |
| 150.3  | 404 |
| 150.4  | 401 |
| 150.5  | 401 |
| 150.6  | 398 |
| 150.7  | 397 |
| 150.8  | 398 |
| 150.9  | 395.4 |
| 151.0  | 394 |
| 151.1  | 392.7 |
| 151.2  | 391.6 |
| 151.3  | 390.5 |
| 151.4  | 388 |
| 151.5  | 388.1 |
| 151.6  | 386.9 |
| 151.7  | 385.8 |
| 151.8  | 384.6 |
| 151.9  | 383.4 |
| 152.0  | 382.2 |
| 152.1  | 380 |
| 152.2  | 379 |
| 152.3  | 378 |
| 152.4  | 376 |
| 152.5  | 376 |
| 152.6  | 373 |
| 152.7  | 372 |
| 152.8  | 373.8 |
| 152.9  | 376.9 |
| 153.0  | 376.5 |
| 153.1  | 373.7 |
| 153.2  | 368.2 |
| 153.3  | 366.3 |
| 153.4  | 364.4 |
| 153.5  | 363.3 |
| 153.6  | 359.6 |
| 153.7  | 363 |
| 153.8  | 362.3 |
| 153.9  | 360 |
| 154.0  | 360 |
| 154.1  | 360 |
| 154.2  | 358 |
| 154.3  | 357 |
| 154.4  | 356 |
| 154.5  | 355 |
| 154.6  | 353 |
| 154.7  | 352 |
| 154.8  | 352 |
| 154.9  | 350 |
| 155.0  | 350 |
| 155.1  | 347.9 |
| 155.2  | 346.2 |
| 155.3  | 344.6 |
| 155.4  | 339.2 |
| 155.5  | 342.6 |
| 155.6  | 339.9 |
| 155.7  | 338.6 |
| 155.8  | 337.1 |
| 155.9  | 336.6 |
| 156.0  | 335.1 |
| 156.1  | 333.7 |
| 156.2  | 334 |
| 156.3  | 332.9 |
| 156.4  | 332.4 |
| 156.5  | 332 |
| 156.6  | 332 |
| 156.7  | 331.4 |
| 156.8  | 330.8 |
| 156.9  | 330.3 |
| 157.0  | 329.6 |
| 157.1  | 328.5 |
| 157.2  | 327.4 |
| 157.3  | 326.3 |
| 157.4  | 325.2 |
| 157.5  | 324.3 |
| 157.6  | 323 |
| 157.7  | 322.2 |
| 157.8  | 320.8 |
| 157.9  | 320.7 |
| 158.0  | 319.8 |
| 158.1  | 318.3 |
| 158.2  | 317.4 |
| 158.3  | 316.7 |
| 158.4  | 316.2 |
| 158.5  | 315.3 |
| 158.6  | 314.2 |
| 158.7  | 313.1 |
| 158.8  | 311.7 |
| 158.9  | 311 |
| 159.0  | 309.9 |
| 159.1  | 308.2 |
| 159.2  | 307.5 |
| 159.3  | 306.5 |
| 159.4  | 305.5 |
| 159.5  | 304.6 |
| 159.6  | 303.8 |
| 159.7  | 303 |
| 159.8  | 301.7 |
| 159.9  | 300.8 |
| 160.0  | 300 |
| 160.1  | 299.2 |
| 160.2  | 298 |
| 160.3  | 296.7 |
| 160.4  | 295.5 |
| 160.5  | 294.4 |
| 160.6  | 293 |
| 160.7  | 291.9 |
| 160.8  | 291.1 |
| 160.9  | 290.1 |
| 161.0  | 289.4 |
| 161.1  | 288.3 |
| 161.2  | 287.5 |
| 161.3  | 286.8 |
| 161.4  | 285.7 |
| 161.5  | 285.1 |
| 161.6  | 283.9 |
| 161.7  | 282.9 |
| 161.8  | 281.7 |
| 161.9  | 280.5 |
| 162.0  | 279.4 |
| 162.1  | 278.5 |
| 162.2  | 277.8 |
| 162.3  | 276.9 |
| 162.4  | 276.2 |
| 162.5  | 275.3 |
| 162.6  | 274.3 |
| 162.7  | 273.5 |
| 162.8  | 272.5 |
| 162.9  | 272 |
| 163.0  | 271.5 |
| 163.1  | 270.4 |
| 163.2  | 269.8 |
| 163.3  | 268.8 |
| 163.4  | 268.1 |
| 163.5  | 267.3 |
| 163.6  | 266.7 |
| 163.7  | 265.2 |
| 163.8  | 263.8 |
| 163.9  | 262.7 |
| 164.0  | 261.4 |
| 164.1  | 260.9 |
| 164.2  | 260.9 |
| 164.3  | 259.9 |
| 164.4  | 259 |
| 164.5  | 258.3 |
| 164.6  | 257.4 |
| 164.7  | 257.2 |
| 164.8  | 255.8 |
| 164.9  | 255.6 |
| 165.0  | 254.1 |
| 165.1  | 253.5 |
| 165.2  | 252 |
| 165.3  | 250.8 |
| 165.4  | 250.2 |
| 165.5  | 249.8 |
| 165.6  | 250.1 |
| 165.7  | 249.1 |
| 165.8  | 248.4 |
| 165.9  | 247.6 |
| 166.0  | 246.7 |
| 166.1  | 246.2 |
| 166.2  | 243 |
| 166.3  | 244 |
| 166.4  | 243 |
| 166.5  | 241 |
| 166.6  | 240 |
| 166.7  | 239 |
| 166.8  | 237 |
| 166.9  | 236 |
| 167.0  | 234 |
| 167.1  | 234 |
| 167.2  | 233 |
| 167.3  | 233 |
| 167.4  | 233 |
| 167.5  | 232 |
| 167.6  | 231 |
| 167.7  | 231 |
| 167.8  | 230 |
| 167.9  | 229 |
| 168.0  | 227 |
| 168.1  | 225 |
| 168.2  | 228.7 |
| 168.3  | 224 |
| 168.4  | 223 |
| 168.5  | 223 |
| 168.6  | 222 |
| 168.7  | 222 |
| 168.8  | 221 |
| 168.9  | 221 |
| 169.0  | 221.6 |
| 169.1  | 221.2 |
| 169.2  | 220.9 |
| 169.3  | 220.3 |
| 169.4  | 219.5 |
| 169.5  | 218.6 |
| 169.6  | 218 |
| 169.7  | 216.9 |
| 169.8  | 215.9 |
| 169.9  | 215 |
| 170.0  | 214 |
| 170.1  | 213.5 |
| 170.2  | 212.8 |
| 170.3  | 212 |
| 170.4  | 211.7 |
| 170.5  | 211.9 |
| 170.6  | 211.9 |
| 170.7  | 212 |
| 170.8  | 212 |
| 170.9  | 212 |
| 171.0  | 211.8 |
| 171.1  | 212.2 |
| 171.2  | 212.6 |
| 171.3  | 211.1 |
| 171.4  | 210 |
| 171.5  | 209.2 |
| 171.6  | 208.7 |
| 171.7  | 208.1 |
| Finish | 207.9 |